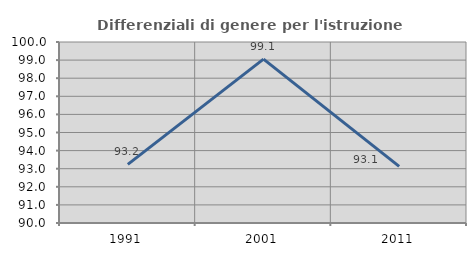
| Category | Differenziali di genere per l'istruzione superiore |
|---|---|
| 1991.0 | 93.236 |
| 2001.0 | 99.053 |
| 2011.0 | 93.126 |